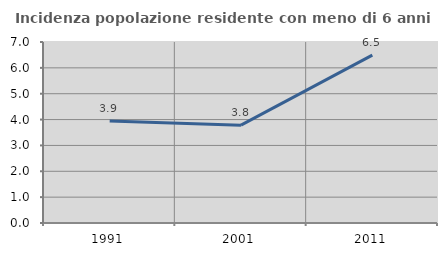
| Category | Incidenza popolazione residente con meno di 6 anni |
|---|---|
| 1991.0 | 3.944 |
| 2001.0 | 3.783 |
| 2011.0 | 6.494 |